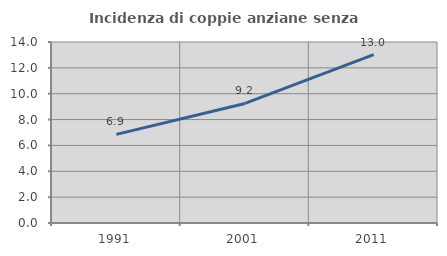
| Category | Incidenza di coppie anziane senza figli  |
|---|---|
| 1991.0 | 6.854 |
| 2001.0 | 9.248 |
| 2011.0 | 13.026 |